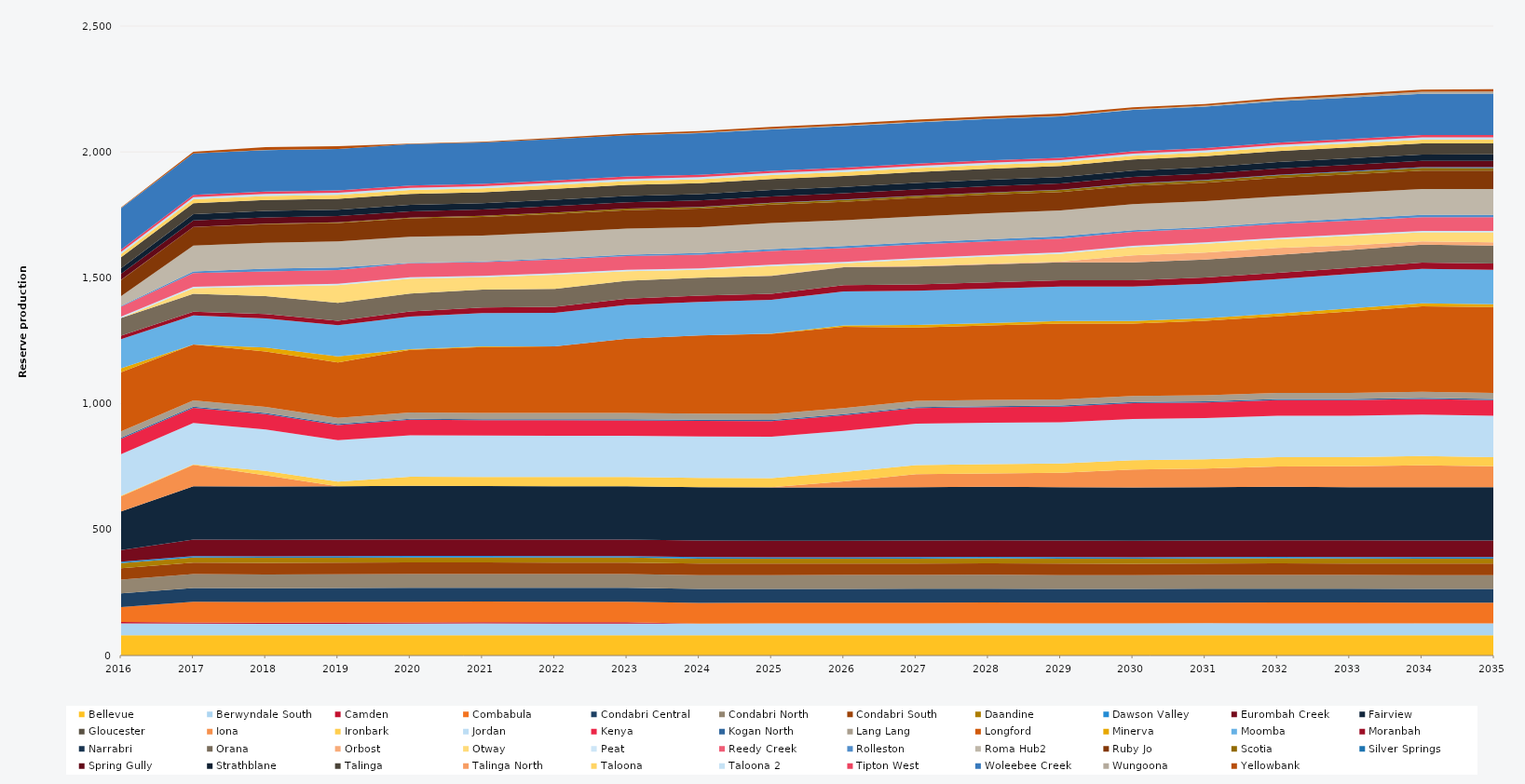
| Category | Bellevue | Berwyndale South | Camden | Combabula | Condabri Central | Condabri North | Condabri South | Daandine | Dawson Valley | Eurombah Creek | Fairview | Gloucester | Iona | Ironbark | Jordan | Kenya | Kogan North | Lang Lang | Longford | Minerva | Moomba | Moranbah | Narrabri | Orana | Orbost | Otway | Peat | Reedy Creek | Rolleston | Roma Hub2 | Ruby Jo | Scotia | Silver Springs | Spring Gully | Strathblane | Talinga | Talinga North | Taloona | Taloona 2 | Tipton West | Woleebee Creek | Wungoona | Yellowbank |
|---|---|---|---|---|---|---|---|---|---|---|---|---|---|---|---|---|---|---|---|---|---|---|---|---|---|---|---|---|---|---|---|---|---|---|---|---|---|---|---|---|---|---|---|
| 2016 | 80.52 | 47.291 | 5 | 59.734 | 54.531 | 54.233 | 45.411 | 20.13 | 5.856 | 46.485 | 152.914 | 0 | 60.226 | 2.587 | 164.7 | 61.44 | 4.392 | 24.522 | 235.041 | 16 | 115.768 | 13.144 | 0 | 71 | 0 | 0 | 5.49 | 39.355 | 2.504 | 39.097 | 64.014 | 0.982 | 0.194 | 23.636 | 22.628 | 43.268 | 0 | 13.215 | 7.494 | 9.516 | 164.7 | 0.518 | 2.362 |
| 2017 | 80.3 | 46.31 | 5 | 82.125 | 54.75 | 54.75 | 45.625 | 20.075 | 5.84 | 65.7 | 211.658 | 0 | 84.98 | 1.968 | 164.25 | 60.781 | 4.38 | 24.455 | 222.562 | 0 | 115.078 | 14.794 | 0 | 71.175 | 0 | 22.115 | 5.475 | 54.75 | 6.361 | 102.908 | 73.702 | 0.664 | 0.034 | 25.185 | 25.185 | 43.8 | 0 | 15.33 | 8.395 | 9.49 | 164.25 | 0.074 | 6.355 |
| 2018 | 80.3 | 45.276 | 5 | 82.125 | 54.75 | 54.75 | 45.625 | 20.075 | 5.84 | 65.7 | 211.7 | 0 | 44.364 | 18.089 | 164.25 | 60.966 | 4.38 | 24.455 | 220 | 15.555 | 115.255 | 17.995 | 0 | 71.175 | 0 | 38 | 5.475 | 54.75 | 10.461 | 102.93 | 73.702 | 1.69 | 0.653 | 25.185 | 25.185 | 43.8 | 0 | 15.33 | 8.395 | 9.49 | 164.25 | 1.599 | 10.489 |
| 2019 | 80.3 | 45.899 | 5 | 82.125 | 54.75 | 54.75 | 45.625 | 20.075 | 5.84 | 65.7 | 211.7 | 0 | 0.69 | 18.25 | 164.25 | 60.546 | 4.38 | 24.455 | 220 | 23.725 | 123.776 | 18.062 | 0 | 71.175 | 0 | 69.826 | 5.475 | 54.75 | 10.527 | 102.93 | 73.702 | 1.962 | 0.009 | 25.185 | 25.185 | 43.8 | 0 | 15.33 | 8.395 | 9.49 | 164.25 | 0.033 | 10.553 |
| 2020 | 80.52 | 46.084 | 5 | 82.35 | 54.9 | 54.9 | 45.75 | 20.13 | 5.856 | 65.88 | 212.28 | 0 | 0 | 36.6 | 164.7 | 61.2 | 4.392 | 24.522 | 248.802 | 2.629 | 130.053 | 19.632 | 0 | 71.37 | 0 | 59.545 | 5.49 | 54.9 | 2.186 | 103.212 | 73.873 | 2.267 | 0 | 25.254 | 25.254 | 43.92 | 0 | 15.372 | 8.418 | 9.516 | 164.7 | 0.008 | 1.894 |
| 2021 | 80.3 | 46.929 | 5 | 82.125 | 54.75 | 54.75 | 45.625 | 20.075 | 5.84 | 65.7 | 211.7 | 0 | 0 | 36.5 | 164.25 | 60.849 | 4.38 | 24.455 | 261.97 | 2.842 | 132.173 | 22.187 | 0 | 71.175 | 0 | 48.636 | 5.475 | 54.75 | 2.902 | 102.93 | 73.674 | 4.146 | 0 | 25.185 | 25.185 | 43.8 | 0 | 15.33 | 8.395 | 9.49 | 164.25 | 0.014 | 2.782 |
| 2022 | 80.3 | 46.551 | 5 | 82.125 | 54.75 | 54.75 | 45.625 | 20.075 | 5.84 | 65.7 | 211.7 | 0 | 0 | 36.5 | 164.25 | 61.28 | 4.38 | 24.455 | 264.464 | 0 | 133.36 | 24.144 | 0 | 71.175 | 0 | 55.993 | 5.475 | 54.75 | 4.876 | 102.93 | 73.63 | 5.722 | 0 | 25.185 | 25.185 | 43.8 | 0 | 15.33 | 8.395 | 9.49 | 164.25 | 0.001 | 4.788 |
| 2023 | 80.3 | 46.579 | 5 | 82.125 | 54.75 | 54.75 | 45.625 | 20.075 | 5.84 | 65.7 | 211.7 | 0 | 0 | 36.5 | 164.25 | 60.954 | 4.38 | 24.455 | 295.675 | 0 | 133.541 | 24.788 | 0 | 71.175 | 0 | 38 | 5.475 | 54.75 | 5.946 | 102.93 | 73.586 | 6.12 | 0.048 | 25.185 | 25.185 | 43.8 | 0 | 15.33 | 8.395 | 9.49 | 164.25 | 0.117 | 5.833 |
| 2024 | 80.52 | 46.333 | 0 | 82.35 | 54.9 | 54.9 | 45.75 | 20.13 | 5.856 | 65.88 | 212.28 | 0 | 0 | 36.6 | 164.7 | 61.597 | 4.392 | 24.522 | 310.296 | 0 | 133.356 | 24.888 | 0 | 71.37 | 0 | 31.491 | 5.49 | 54.9 | 5.752 | 103.212 | 73.713 | 5.751 | 0.976 | 25.254 | 25.254 | 43.92 | 0 | 15.372 | 8.418 | 9.516 | 164.7 | 2.401 | 5.886 |
| 2025 | 80.3 | 47.36 | 0 | 82.125 | 54.75 | 54.75 | 45.625 | 19.414 | 5.84 | 65.7 | 211.7 | 0 | 0.824 | 36.5 | 164.25 | 62.14 | 4.031 | 24.455 | 318.062 | 0.478 | 134.054 | 24.82 | 0 | 71.175 | 0.678 | 38 | 5.475 | 54.75 | 7.428 | 102.93 | 73.498 | 6.236 | 1.113 | 25.185 | 25.185 | 43.8 | 0 | 15.33 | 8.395 | 8.92 | 164.25 | 2.739 | 7.595 |
| 2026 | 80.3 | 47.68 | 0 | 82.125 | 54.75 | 54.75 | 45.625 | 19.491 | 5.84 | 65.7 | 211.7 | 0 | 23.675 | 36.5 | 164.25 | 61.82 | 4.183 | 24.455 | 322.91 | 5.43 | 134.586 | 24.82 | 0 | 71.175 | 1.898 | 14.436 | 5.475 | 54.75 | 7.62 | 102.93 | 73.455 | 7.114 | 1.364 | 25.185 | 25.185 | 43.8 | 0 | 15.33 | 8.395 | 9.105 | 164.25 | 3.194 | 7.773 |
| 2027 | 80.3 | 47.72 | 0 | 82.125 | 54.75 | 54.75 | 45.625 | 19.639 | 5.84 | 65.7 | 211.7 | 0 | 51.868 | 36.5 | 164.25 | 61.78 | 4.18 | 24.455 | 291.795 | 9.946 | 135.887 | 24.82 | 0 | 71.175 | 2.255 | 25.647 | 5.475 | 54.75 | 8.147 | 102.93 | 73.411 | 7.755 | 1.003 | 25.185 | 25.185 | 43.8 | 0 | 15.33 | 8.395 | 9.255 | 164.25 | 2.54 | 8.291 |
| 2028 | 80.52 | 47.98 | 0 | 82.35 | 54.9 | 54.9 | 45.75 | 19.782 | 5.856 | 65.88 | 212.28 | 0 | 52.731 | 36.6 | 164.7 | 61.82 | 4.202 | 24.522 | 296.342 | 9.537 | 136.618 | 24.888 | 0 | 71.37 | 2.916 | 28.246 | 5.49 | 54.9 | 8.477 | 103.212 | 73.537 | 7.832 | 0.685 | 25.254 | 25.254 | 43.92 | 0 | 15.372 | 8.418 | 9.242 | 164.7 | 1.785 | 8.558 |
| 2029 | 80.3 | 47.44 | 0 | 82.125 | 54.75 | 54.75 | 45.625 | 19.853 | 5.84 | 65.7 | 211.7 | 0 | 57.753 | 36.5 | 164.25 | 62.06 | 4.209 | 24.455 | 301.181 | 10.346 | 136.513 | 24.82 | 0 | 71.175 | 3.197 | 30.925 | 5.475 | 54.75 | 9.063 | 102.93 | 73.323 | 8.004 | 0.919 | 25.185 | 25.185 | 43.8 | 0 | 15.33 | 8.395 | 9.296 | 164.25 | 2.144 | 8.995 |
| 2030 | 80.3 | 47.02 | 0 | 82.125 | 54.75 | 54.75 | 45.625 | 19.886 | 5.84 | 65.7 | 211.7 | 0 | 71.288 | 36.5 | 164.25 | 62.48 | 4.322 | 24.455 | 287.047 | 10.625 | 136.875 | 24.82 | 0 | 71.175 | 27.375 | 33.121 | 5.475 | 54.75 | 7.091 | 102.93 | 73.279 | 8.862 | 1.236 | 25.185 | 25.185 | 43.8 | 0 | 15.33 | 8.395 | 9.351 | 164.25 | 3.004 | 7.091 |
| 2031 | 80.3 | 47.78 | 0 | 82.125 | 54.75 | 54.75 | 45.625 | 19.961 | 5.84 | 65.7 | 211.7 | 0 | 73.99 | 36.5 | 164.25 | 61.72 | 4.346 | 24.455 | 296.13 | 10.064 | 136.875 | 24.82 | 0 | 71.175 | 27.375 | 34.973 | 5.475 | 54.75 | 5.961 | 102.93 | 73.235 | 9.428 | 1.609 | 25.185 | 25.185 | 43.8 | 0 | 15.33 | 8.395 | 9.399 | 164.25 | 4.03 | 5.916 |
| 2032 | 80.52 | 47.46 | 0.153 | 82.35 | 54.9 | 54.9 | 45.75 | 20.05 | 5.856 | 65.88 | 212.28 | 0 | 80.695 | 36.6 | 164.7 | 62.34 | 4.367 | 24.522 | 303.718 | 11.027 | 137.25 | 24.888 | 0 | 71.37 | 27.45 | 34.316 | 5.49 | 54.9 | 6.673 | 103.212 | 73.361 | 9.922 | 2.247 | 25.254 | 25.254 | 43.92 | 0 | 15.372 | 8.418 | 9.516 | 164.7 | 5.612 | 6.665 |
| 2033 | 80.3 | 47.22 | 0.847 | 82.125 | 54.75 | 54.75 | 45.625 | 20.048 | 5.84 | 65.7 | 211.7 | 0 | 82.547 | 36.5 | 164.25 | 62.28 | 4.367 | 24.455 | 323.349 | 11.423 | 136.875 | 24.82 | 0 | 71.175 | 18.123 | 38.007 | 5.475 | 54.75 | 7.656 | 102.93 | 73.147 | 10.328 | 2.837 | 25.185 | 25.185 | 43.8 | 0 | 15.33 | 8.395 | 9.473 | 164.25 | 6.996 | 7.727 |
| 2034 | 80.3 | 47.32 | 0 | 82.125 | 54.75 | 54.75 | 45.625 | 20.062 | 5.84 | 65.7 | 211.7 | 0 | 87.605 | 36.5 | 164.25 | 62.18 | 4.378 | 24.455 | 339.199 | 12.058 | 136.875 | 24.82 | 0 | 71.175 | 13.333 | 36.132 | 5.475 | 54.75 | 8.582 | 102.93 | 73.103 | 10.626 | 3.134 | 25.185 | 25.185 | 43.8 | 0 | 15.33 | 8.395 | 9.468 | 164.25 | 7.793 | 8.677 |
| 2035 | 80.3 | 47.3 | 0 | 82.125 | 54.75 | 54.75 | 45.625 | 20.054 | 5.84 | 65.7 | 211.7 | 0 | 83.186 | 36.5 | 164.25 | 62.2 | 4.38 | 24.455 | 340.494 | 11.285 | 136.875 | 24.82 | 0 | 71.175 | 13.219 | 39.734 | 5.475 | 54.75 | 9.209 | 102.93 | 72.753 | 10.627 | 3.405 | 25.185 | 25.185 | 43.8 | 0 | 15.33 | 8.395 | 9.49 | 164.25 | 8.52 | 9.274 |